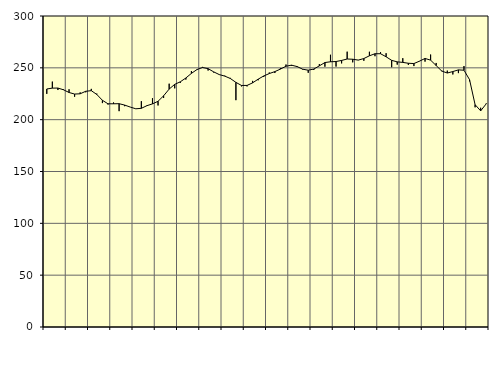
| Category | Piggar | Series 1 |
|---|---|---|
| nan | 224.9 | 229.61 |
| 1.0 | 236.7 | 230.42 |
| 1.0 | 228.6 | 230.5 |
| 1.0 | 229.3 | 228.82 |
| nan | 229.3 | 226.21 |
| 2.0 | 222.1 | 224.71 |
| 2.0 | 226.3 | 224.96 |
| 2.0 | 226.4 | 227.39 |
| nan | 229.7 | 227.98 |
| 3.0 | 225.1 | 224.27 |
| 3.0 | 216 | 218.68 |
| 3.0 | 214.6 | 215.32 |
| nan | 216.6 | 215.31 |
| 4.0 | 208.2 | 215.41 |
| 4.0 | 213 | 214.06 |
| 4.0 | 212.2 | 212.16 |
| nan | 210.6 | 210.49 |
| 5.0 | 217.8 | 210.95 |
| 5.0 | 213.2 | 213.49 |
| 5.0 | 220.7 | 215.22 |
| nan | 213.7 | 217.73 |
| 6.0 | 220.9 | 223.01 |
| 6.0 | 234.7 | 229.51 |
| 6.0 | 230.2 | 234.08 |
| nan | 235.5 | 236.51 |
| 7.0 | 238.7 | 240.2 |
| 7.0 | 246.9 | 244.65 |
| 7.0 | 248.1 | 248.34 |
| nan | 250.9 | 250.31 |
| 8.0 | 247.4 | 249.2 |
| 8.0 | 245.5 | 246.13 |
| 8.0 | 243.6 | 243.5 |
| nan | 242.4 | 242.01 |
| 9.0 | 240.3 | 239.71 |
| 9.0 | 218.8 | 235.96 |
| 9.0 | 232.1 | 233.01 |
| nan | 232.1 | 233.03 |
| 10.0 | 237.4 | 235.52 |
| 10.0 | 238 | 239.06 |
| 10.0 | 241.2 | 242.16 |
| nan | 245.5 | 244.46 |
| 11.0 | 245 | 246.36 |
| 11.0 | 249.8 | 248.78 |
| 11.0 | 253.2 | 251.53 |
| nan | 251.9 | 252.57 |
| 12.0 | 251.7 | 251.22 |
| 12.0 | 248.3 | 248.68 |
| 12.0 | 245.2 | 247.72 |
| nan | 247.9 | 248.82 |
| 13.0 | 253.6 | 251.91 |
| 13.0 | 251.1 | 255.1 |
| 13.0 | 262.6 | 255.85 |
| nan | 251.2 | 256.09 |
| 14.0 | 254.3 | 257.14 |
| 14.0 | 265.6 | 258.51 |
| 14.0 | 255.3 | 258.28 |
| nan | 257.6 | 257.46 |
| 15.0 | 256.8 | 258.97 |
| 15.0 | 265.5 | 261.62 |
| 15.0 | 261.2 | 263.6 |
| nan | 265.1 | 263.61 |
| 16.0 | 264.1 | 260.66 |
| 16.0 | 250.6 | 257.22 |
| 16.0 | 253.1 | 255.77 |
| nan | 259.3 | 255.25 |
| 17.0 | 252.8 | 254.42 |
| 17.0 | 251.7 | 254.12 |
| 17.0 | 256.6 | 256.43 |
| nan | 256 | 259.04 |
| 18.0 | 262.8 | 257.42 |
| 18.0 | 254.7 | 252.2 |
| 18.0 | 247.3 | 246.88 |
| nan | 247.3 | 245 |
| 19.0 | 243.6 | 246.41 |
| 19.0 | 244.9 | 248.02 |
| 19.0 | 251.7 | 247.71 |
| nan | 237 | 238.64 |
| 20.0 | 211.9 | 214.44 |
| 20.0 | 211.5 | 208.5 |
| 20.0 | 215.8 | 215.27 |